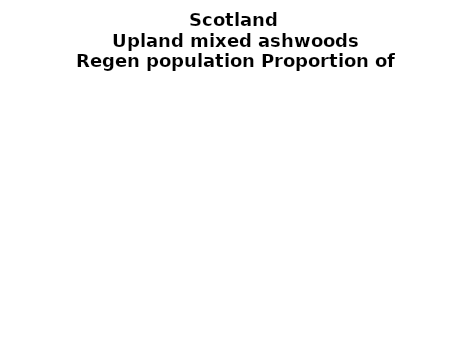
| Category | Upland mixed ashwoods |
|---|---|
| None | 0.03 |
| Seedlings only | 0 |
| Seedlings, saplings only | 0.029 |
| Seedlings, saplings, <7 cm trees | 0.143 |
| Saplings only | 0.188 |
| <7 cm trees, seedlings only | 0 |
| <7 cm trees, saplings only | 0.434 |
| <7 cm Trees only | 0.176 |